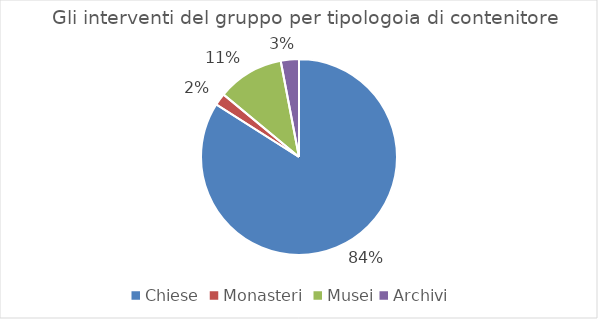
| Category | Series 0 |
|---|---|
| Chiese  | 0.84 |
| Monasteri  | 0.02 |
| Musei | 0.11 |
| Archivi  | 0.03 |